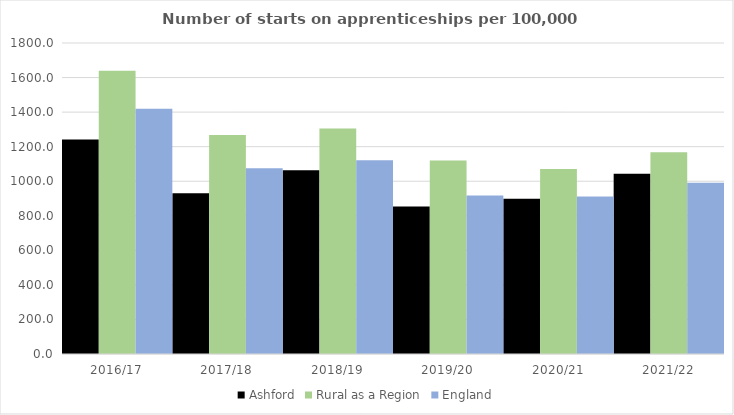
| Category | Ashford | Rural as a Region | England |
|---|---|---|---|
| 2016/17 | 1241 | 1638.789 | 1420 |
| 2017/18 | 930 | 1267.474 | 1075 |
| 2018/19 | 1064 | 1304.57 | 1122 |
| 2019/20 | 854 | 1119.662 | 918 |
| 2020/21 | 898 | 1070.748 | 912 |
| 2021/22 | 1043 | 1167.68 | 991 |